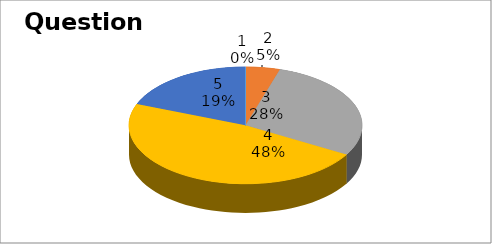
| Category | Series 0 |
|---|---|
| 0 | 0 |
| 1 | 1 |
| 2 | 6 |
| 3 | 10 |
| 4 | 4 |